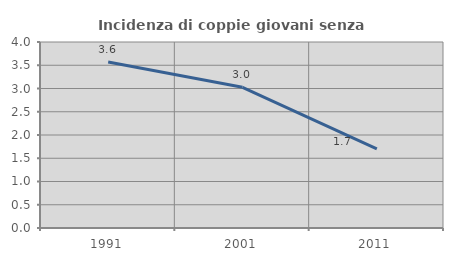
| Category | Incidenza di coppie giovani senza figli |
|---|---|
| 1991.0 | 3.571 |
| 2001.0 | 3.026 |
| 2011.0 | 1.702 |